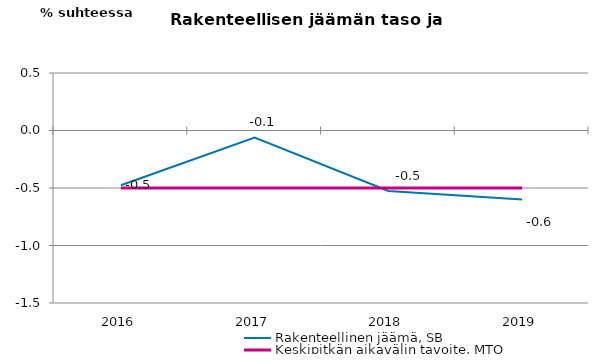
| Category | Rakenteellinen jäämä, SB | Keskipitkän aikavälin tavoite, MTO |
|---|---|---|
| 2016.0 | -0.476 | -0.5 |
| 2017.0 | -0.062 | -0.5 |
| 2018.0 | -0.526 | -0.5 |
| 2019.0 | -0.6 | -0.5 |